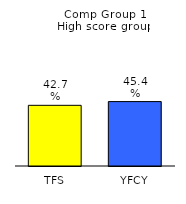
| Category | Series 0 |
|---|---|
| TFS | 0.427 |
| YFCY | 0.454 |